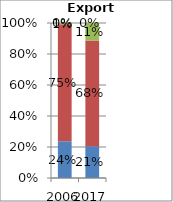
| Category | Other commercial services | Travel | Transport | Goods-related services |
|---|---|---|---|---|
| 2006.0 | 0.237 | 0.754 | 0.009 | 0 |
| 2017.0 | 0.205 | 0.682 | 0.113 | 0 |